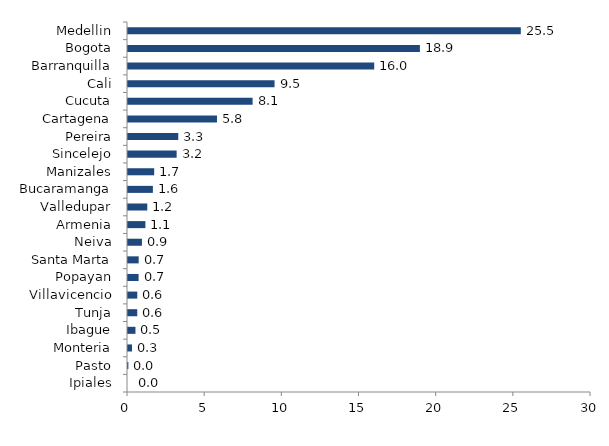
| Category | Series 0 |
|---|---|
| Ipiales | 0 |
| Pasto | 0.024 |
| Monteria | 0.259 |
| Ibague | 0.484 |
| Tunja | 0.599 |
| Villavicencio | 0.599 |
| Popayan | 0.686 |
| Santa Marta | 0.692 |
| Neiva | 0.904 |
| Armenia | 1.128 |
| Valledupar | 1.249 |
| Bucaramanga | 1.612 |
| Manizales | 1.698 |
| Sincelejo | 3.151 |
| Pereira | 3.257 |
| Cartagena | 5.766 |
| Cucuta | 8.073 |
| Cali | 9.496 |
| Barranquilla | 15.954 |
| Bogota | 18.915 |
| Medellin | 25.453 |